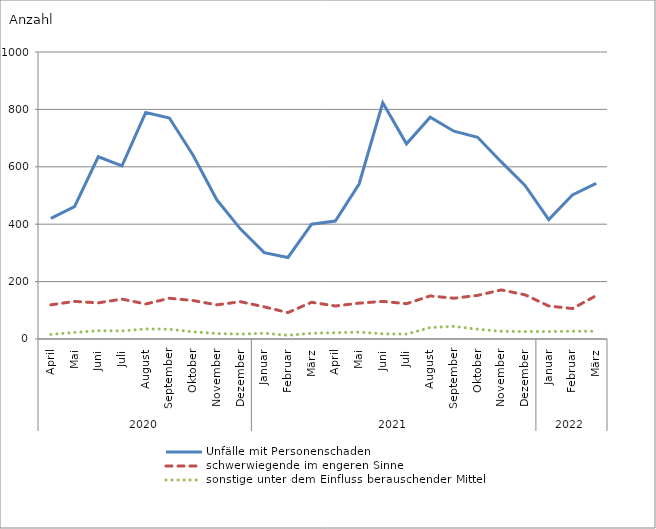
| Category | Unfälle mit Personenschaden | schwerwiegende im engeren Sinne | sonstige unter dem Einfluss berauschender Mittel |
|---|---|---|---|
| 0 | 420 | 119 | 16 |
| 1 | 461 | 131 | 23 |
| 2 | 635 | 126 | 29 |
| 3 | 603 | 139 | 28 |
| 4 | 789 | 122 | 35 |
| 5 | 770 | 142 | 34 |
| 6 | 640 | 134 | 25 |
| 7 | 485 | 119 | 19 |
| 8 | 383 | 130 | 17 |
| 9 | 301 | 112 | 20 |
| 10 | 284 | 92 | 13 |
| 11 | 400 | 128 | 20 |
| 12 | 411 | 115 | 22 |
| 13 | 540 | 125 | 24 |
| 14 | 823 | 131 | 18 |
| 15 | 680 | 123 | 17 |
| 16 | 773 | 150 | 40 |
| 17 | 724 | 142 | 44 |
| 18 | 703 | 152 | 34 |
| 19 | 617 | 171 | 27 |
| 20 | 535 | 154 | 26 |
| 21 | 416 | 115 | 26 |
| 22 | 502 | 106 | 27 |
| 23 | 542 | 151 | 27 |